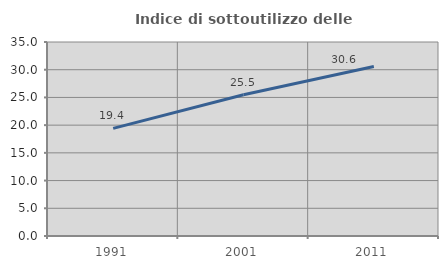
| Category | Indice di sottoutilizzo delle abitazioni  |
|---|---|
| 1991.0 | 19.409 |
| 2001.0 | 25.492 |
| 2011.0 | 30.581 |